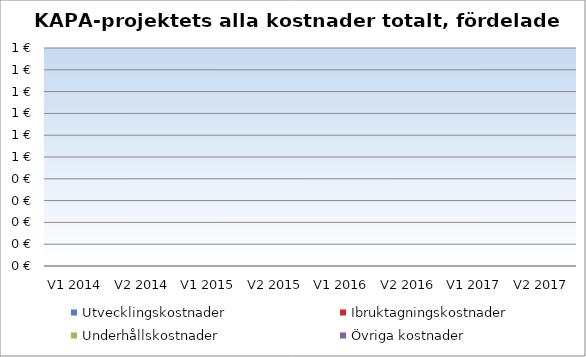
| Category | Utvecklingskostnader | Ibruktagningskostnader | Underhållskostnader | Övriga kostnader |
|---|---|---|---|---|
| V1 2014 | 0 | 0 | 0 | 0 |
| V2 2014 | 0 | 0 | 0 | 0 |
| V1 2015 | 0 | 0 | 0 | 0 |
| V2 2015 | 0 | 0 | 0 | 0 |
| V1 2016 | 0 | 0 | 0 | 0 |
| V2 2016 | 0 | 0 | 0 | 0 |
| V1 2017 | 0 | 0 | 0 | 0 |
| V2 2017 | 0 | 0 | 0 | 0 |